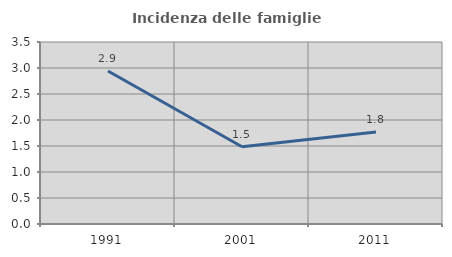
| Category | Incidenza delle famiglie numerose |
|---|---|
| 1991.0 | 2.943 |
| 2001.0 | 1.485 |
| 2011.0 | 1.768 |